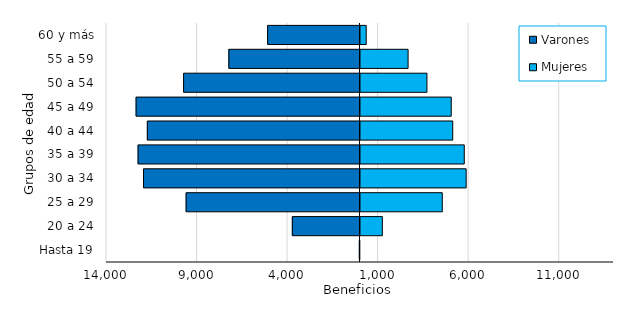
| Category | Varones | Mujeres |
|---|---|---|
| Hasta 19 | -37 | 8 |
| 20 a 24 | -3737 | 1261 |
| 25 a 29 | -9602 | 4571 |
| 30 a 34 | -11955 | 5891 |
| 35 a 39 | -12256 | 5786 |
| 40 a 44 | -11744 | 5149 |
| 45 a 49 | -12365 | 5066 |
| 50 a 54 | -9742 | 3724 |
| 55 a 59 | -7243 | 2683 |
| 60 y más | -5102 | 370 |